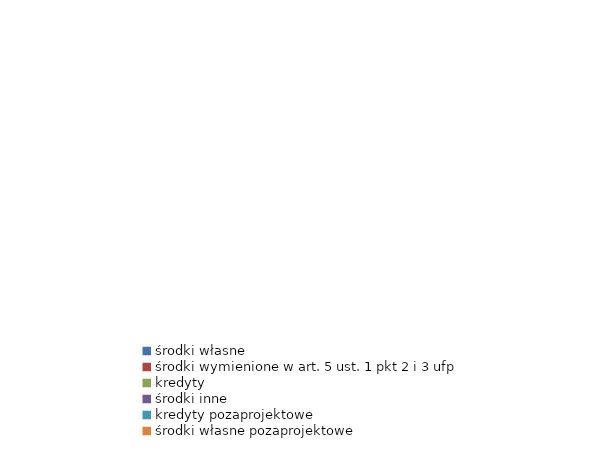
| Category | Series 0 |
|---|---|
| środki własne | 0 |
| środki wymienione w art. 5 ust. 1 pkt 2 i 3 ufp | 0 |
| kredyty | 0 |
| środki inne | 0 |
| kredyty pozaprojektowe | 0 |
| środki własne pozaprojektowe | 0 |